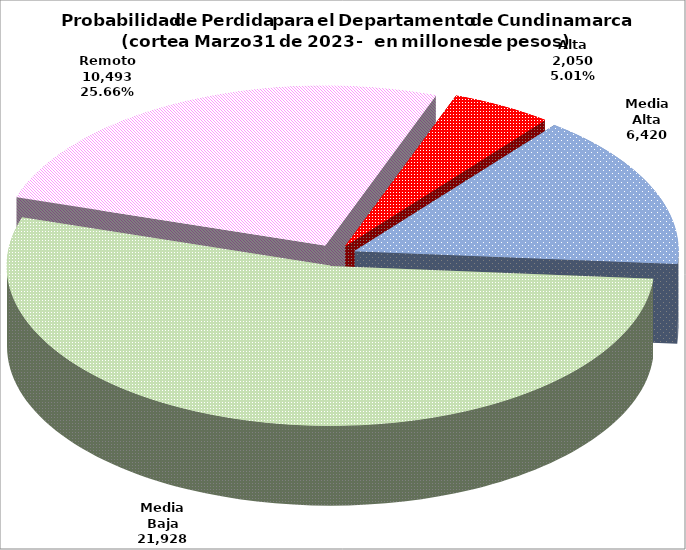
| Category | Series 0 |
|---|---|
| Alta | 2049.7 |
| Media Alta | 6420.451 |
| Media Baja | 21928.157 |
| Remoto | 10492.872 |